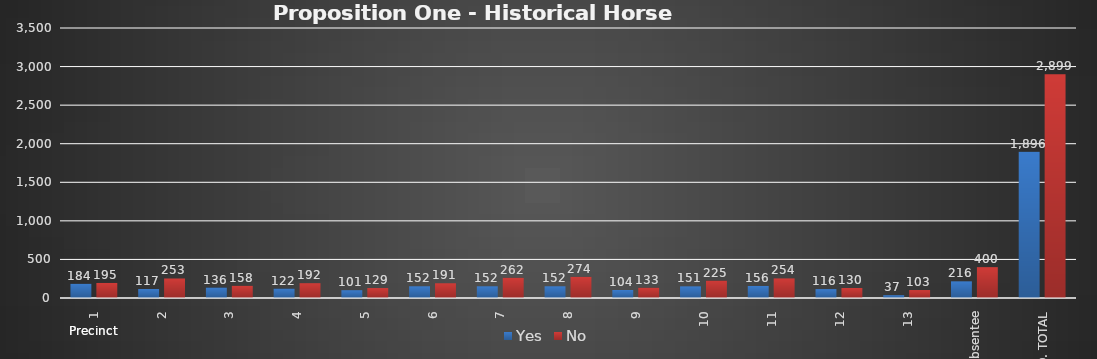
| Category | Yes | No |
|---|---|---|
| 1 | 184 | 195 |
| 2 | 117 | 253 |
| 3 | 136 | 158 |
| 4 | 122 | 192 |
| 5 | 101 | 129 |
| 6 | 152 | 191 |
| 7 | 152 | 262 |
| 8 | 152 | 274 |
| 9 | 104 | 133 |
| 10 | 151 | 225 |
| 11 | 156 | 254 |
| 12 | 116 | 130 |
| 13 | 37 | 103 |
| Absentee | 216 | 400 |
| CO. TOTAL | 1896 | 2899 |